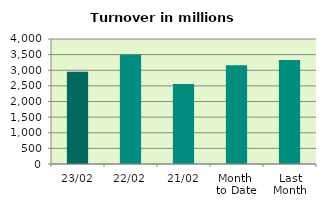
| Category | Series 0 |
|---|---|
| 23/02 | 2952.807 |
| 22/02 | 3506.368 |
| 21/02 | 2559.154 |
| Month 
to Date | 3161.812 |
| Last
Month | 3330.335 |